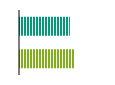
| Category | Series 0 |
|---|---|
| 0 | 163000 |
| 1 | 158040 |